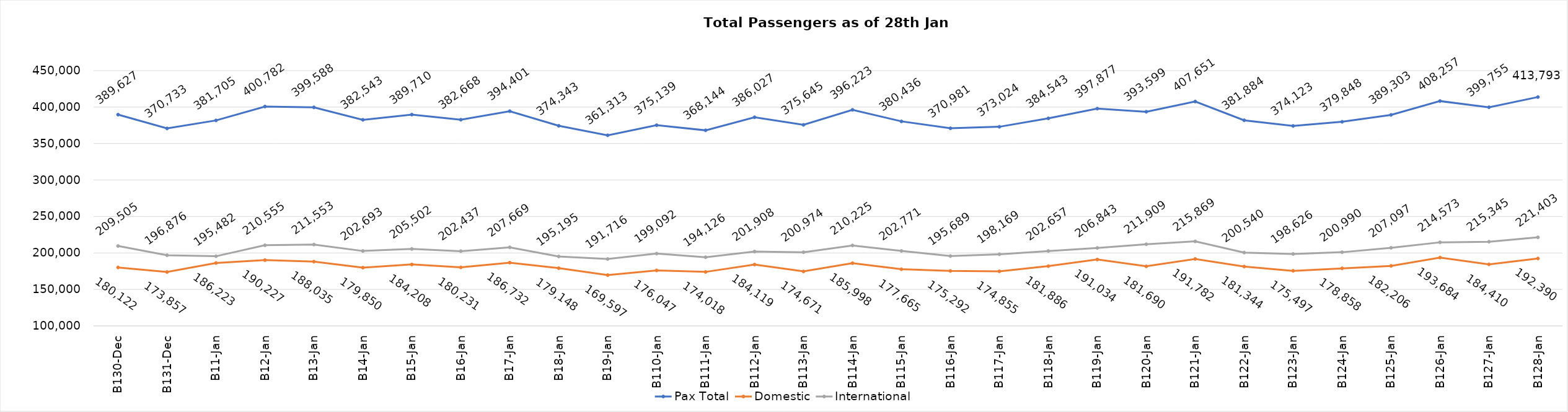
| Category | Pax Total | Domestic | International |
|---|---|---|---|
| 2023-12-30 | 389627 | 180122 | 209505 |
| 2023-12-31 | 370733 | 173857 | 196876 |
| 2024-01-01 | 381705 | 186223 | 195482 |
| 2024-01-02 | 400782 | 190227 | 210555 |
| 2024-01-03 | 399588 | 188035 | 211553 |
| 2024-01-04 | 382543 | 179850 | 202693 |
| 2024-01-05 | 389710 | 184208 | 205502 |
| 2024-01-06 | 382668 | 180231 | 202437 |
| 2024-01-07 | 394401 | 186732 | 207669 |
| 2024-01-08 | 374343 | 179148 | 195195 |
| 2024-01-09 | 361313 | 169597 | 191716 |
| 2024-01-10 | 375139 | 176047 | 199092 |
| 2024-01-11 | 368144 | 174018 | 194126 |
| 2024-01-12 | 386027 | 184119 | 201908 |
| 2024-01-13 | 375645 | 174671 | 200974 |
| 2024-01-14 | 396223 | 185998 | 210225 |
| 2024-01-15 | 380436 | 177665 | 202771 |
| 2024-01-16 | 370981 | 175292 | 195689 |
| 2024-01-17 | 373024 | 174855 | 198169 |
| 2024-01-18 | 384543 | 181886 | 202657 |
| 2024-01-19 | 397877 | 191034 | 206843 |
| 2024-01-20 | 393599 | 181690 | 211909 |
| 2024-01-21 | 407651 | 191782 | 215869 |
| 2024-01-22 | 381884 | 181344 | 200540 |
| 2024-01-23 | 374123 | 175497 | 198626 |
| 2024-01-24 | 379848 | 178858 | 200990 |
| 2024-01-25 | 389303 | 182206 | 207097 |
| 2024-01-26 | 408257 | 193684 | 214573 |
| 2024-01-27 | 399755 | 184410 | 215345 |
| 2024-01-28 | 413793 | 192390 | 221403 |